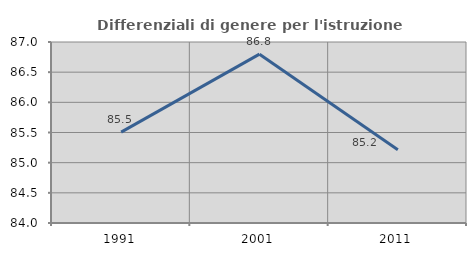
| Category | Differenziali di genere per l'istruzione superiore |
|---|---|
| 1991.0 | 85.507 |
| 2001.0 | 86.798 |
| 2011.0 | 85.215 |